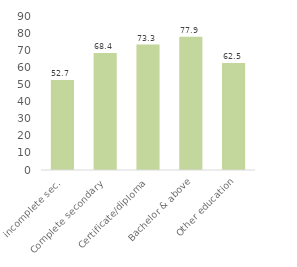
| Category | Series 0 |
|---|---|
| incomplete sec. | 52.66 |
| Complete secondary | 68.371 |
| Certificate/diploma | 73.338 |
| Bachelor & above | 77.895 |
| Other education | 62.52 |